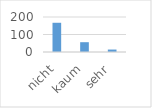
| Category | Series 0 |
|---|---|
| nicht | 167 |
| kaum | 56 |
| sehr | 14 |